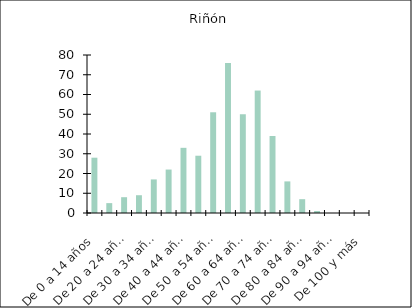
| Category | Riñón |
|---|---|
| De 0 a 14 años | 28 |
| De 15 a 19 años | 5 |
| De 20 a 24 años | 8 |
| De 25 a 29 años | 9 |
| De 30 a 34 años | 17 |
| De 35 a 39 años | 22 |
| De 40 a 44 años | 33 |
| De 45 a 49 años | 29 |
| De 50 a 54 años | 51 |
| De 55 a 59 años | 76 |
| De 60 a 64 años | 50 |
| De 65 a 69 años | 62 |
| De 70 a 74 años | 39 |
| De 75 a 79 años | 16 |
| De 80 a 84 años | 7 |
| De 85 a 89 años | 1 |
| De 90 a 94 años | 0 |
| De 95 a 99 años | 0 |
| De 100 y más | 0 |